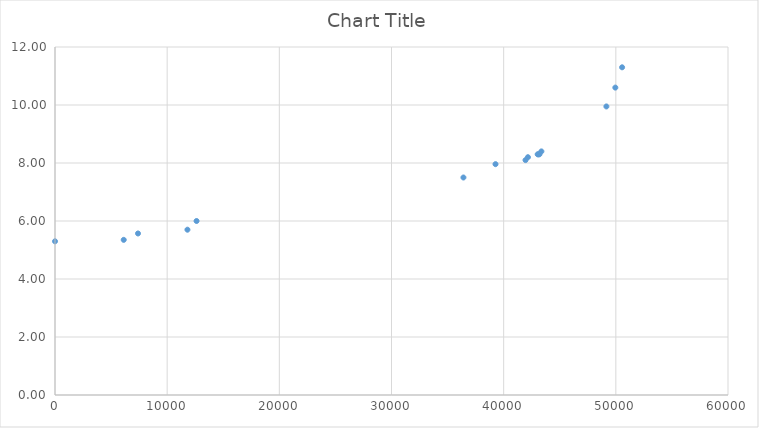
| Category | Series 0 |
|---|---|
| 0.0 | 5.3 |
| 6127.0 | 5.35 |
| 7400.0 | 5.57 |
| 11808.0 | 5.7 |
| 12620.0 | 6 |
| 36413.0 | 7.5 |
| 39273.0 | 7.96 |
| 41948.0 | 8.1 |
| 42163.0 | 8.2 |
| 43033.0 | 8.3 |
| 43098.0 | 8.3 |
| 43188.0 | 8.3 |
| 43364.0 | 8.4 |
| 49158.0 | 9.95 |
| 49955.0 | 10.6 |
| 50559.0 | 11.3 |